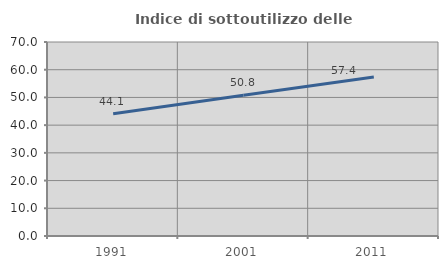
| Category | Indice di sottoutilizzo delle abitazioni  |
|---|---|
| 1991.0 | 44.132 |
| 2001.0 | 50.75 |
| 2011.0 | 57.364 |